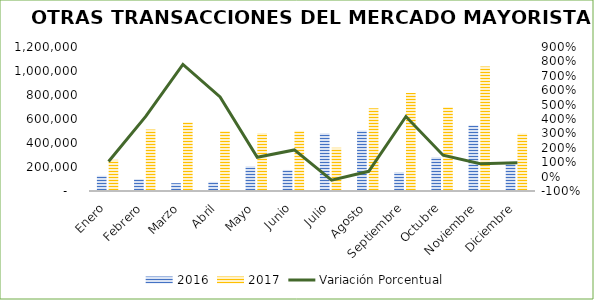
| Category | 2016 | 2017 |
|---|---|---|
| Enero | 126865 | 259855 |
| Febrero | 98915 | 512133 |
| Marzo | 65194 | 572822 |
| Abril | 76383 | 499140 |
| Mayo | 206015 | 482256 |
| Junio | 175588 | 500983 |
| Julio | 480892 | 360300 |
| Agosto | 503949 | 689242 |
| Septiembre | 158077 | 817671 |
| Octubre | 281229 | 698932 |
| Noviembre | 547399 | 1037465 |
| Diciembre | 243240 | 478905 |